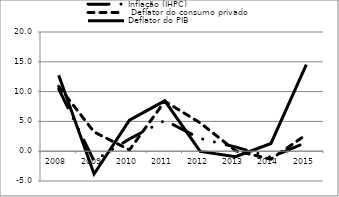
| Category | Inflação (IHPC) |  Deflator do consumo privado | Deflator do PIB |
|---|---|---|---|
| 2008.0 | 10.445 | 10.882 | 12.763 |
| 2009.0 | -1.637 | 3.232 | -3.825 |
| 2010.0 | 2.055 | 0.218 | 5.215 |
| 2011.0 | 5.17 | 8.378 | 8.453 |
| 2012.0 | 2.131 | 4.751 | -0.027 |
| 2013.0 | 0.703 | 0.075 | -0.932 |
| 2014.0 | -1.016 | -1.339 | 1.298 |
| 2015.0 | 1.481 | 2.784 | 14.52 |